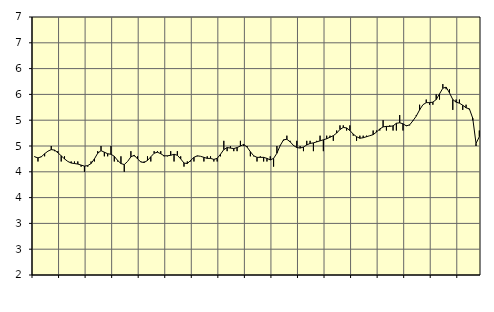
| Category | Piggar | Personliga och kulturella tjänster, SNI 90-98 |
|---|---|---|
| nan | 4.3 | 4.29 |
| 87.0 | 4.2 | 4.27 |
| 87.0 | 4.3 | 4.29 |
| 87.0 | 4.3 | 4.35 |
| nan | 4.4 | 4.4 |
| 88.0 | 4.5 | 4.43 |
| 88.0 | 4.4 | 4.42 |
| 88.0 | 4.4 | 4.37 |
| nan | 4.2 | 4.31 |
| 89.0 | 4.3 | 4.25 |
| 89.0 | 4.2 | 4.2 |
| 89.0 | 4.2 | 4.17 |
| nan | 4.2 | 4.16 |
| 90.0 | 4.2 | 4.15 |
| 90.0 | 4.1 | 4.13 |
| 90.0 | 4 | 4.11 |
| nan | 4.1 | 4.12 |
| 91.0 | 4.2 | 4.16 |
| 91.0 | 4.2 | 4.25 |
| 91.0 | 4.4 | 4.36 |
| nan | 4.5 | 4.41 |
| 92.0 | 4.3 | 4.38 |
| 92.0 | 4.3 | 4.35 |
| 92.0 | 4.5 | 4.34 |
| nan | 4.2 | 4.3 |
| 93.0 | 4.2 | 4.22 |
| 93.0 | 4.3 | 4.16 |
| 93.0 | 4 | 4.14 |
| nan | 4.2 | 4.2 |
| 94.0 | 4.4 | 4.29 |
| 94.0 | 4.3 | 4.32 |
| 94.0 | 4.3 | 4.25 |
| nan | 4.2 | 4.19 |
| 95.0 | 4.2 | 4.18 |
| 95.0 | 4.3 | 4.22 |
| 95.0 | 4.2 | 4.29 |
| nan | 4.4 | 4.36 |
| 96.0 | 4.4 | 4.38 |
| 96.0 | 4.4 | 4.35 |
| 96.0 | 4.3 | 4.31 |
| nan | 4.3 | 4.31 |
| 97.0 | 4.4 | 4.32 |
| 97.0 | 4.2 | 4.34 |
| 97.0 | 4.4 | 4.32 |
| nan | 4.3 | 4.25 |
| 98.0 | 4.1 | 4.17 |
| 98.0 | 4.2 | 4.16 |
| 98.0 | 4.2 | 4.22 |
| nan | 4.2 | 4.28 |
| 99.0 | 4.3 | 4.31 |
| 99.0 | 4.3 | 4.3 |
| 99.0 | 4.2 | 4.28 |
| nan | 4.3 | 4.26 |
| 0.0 | 4.3 | 4.26 |
| 0.0 | 4.2 | 4.24 |
| 0.0 | 4.2 | 4.26 |
| nan | 4.3 | 4.34 |
| 1.0 | 4.6 | 4.43 |
| 1.0 | 4.4 | 4.47 |
| 1.0 | 4.5 | 4.46 |
| nan | 4.4 | 4.45 |
| 2.0 | 4.4 | 4.47 |
| 2.0 | 4.6 | 4.5 |
| 2.0 | 4.5 | 4.53 |
| nan | 4.5 | 4.48 |
| 3.0 | 4.3 | 4.39 |
| 3.0 | 4.3 | 4.31 |
| 3.0 | 4.2 | 4.28 |
| nan | 4.3 | 4.28 |
| 4.0 | 4.2 | 4.28 |
| 4.0 | 4.2 | 4.26 |
| 4.0 | 4.3 | 4.23 |
| nan | 4.1 | 4.26 |
| 5.0 | 4.5 | 4.36 |
| 5.0 | 4.5 | 4.51 |
| 5.0 | 4.6 | 4.62 |
| nan | 4.7 | 4.63 |
| 6.0 | 4.6 | 4.58 |
| 6.0 | 4.5 | 4.51 |
| 6.0 | 4.6 | 4.47 |
| nan | 4.5 | 4.46 |
| 7.0 | 4.4 | 4.48 |
| 7.0 | 4.6 | 4.52 |
| 7.0 | 4.6 | 4.55 |
| nan | 4.4 | 4.56 |
| 8.0 | 4.6 | 4.58 |
| 8.0 | 4.7 | 4.6 |
| 8.0 | 4.4 | 4.62 |
| nan | 4.7 | 4.64 |
| 9.0 | 4.7 | 4.67 |
| 9.0 | 4.6 | 4.7 |
| 9.0 | 4.8 | 4.75 |
| nan | 4.9 | 4.82 |
| 10.0 | 4.9 | 4.86 |
| 10.0 | 4.8 | 4.85 |
| 10.0 | 4.9 | 4.8 |
| nan | 4.7 | 4.73 |
| 11.0 | 4.6 | 4.68 |
| 11.0 | 4.7 | 4.65 |
| 11.0 | 4.7 | 4.66 |
| nan | 4.7 | 4.68 |
| 12.0 | 4.7 | 4.7 |
| 12.0 | 4.8 | 4.72 |
| 12.0 | 4.8 | 4.77 |
| nan | 4.8 | 4.83 |
| 13.0 | 5 | 4.87 |
| 13.0 | 4.8 | 4.88 |
| 13.0 | 4.9 | 4.88 |
| nan | 4.8 | 4.89 |
| 14.0 | 4.8 | 4.94 |
| 14.0 | 5.1 | 4.95 |
| 14.0 | 4.8 | 4.93 |
| nan | 4.9 | 4.89 |
| 15.0 | 4.9 | 4.91 |
| 15.0 | 5 | 4.99 |
| 15.0 | 5.1 | 5.08 |
| nan | 5.3 | 5.2 |
| 16.0 | 5.3 | 5.3 |
| 16.0 | 5.4 | 5.34 |
| 16.0 | 5.3 | 5.34 |
| nan | 5.3 | 5.35 |
| 17.0 | 5.5 | 5.4 |
| 17.0 | 5.4 | 5.51 |
| 17.0 | 5.7 | 5.62 |
| nan | 5.6 | 5.64 |
| 18.0 | 5.6 | 5.53 |
| 18.0 | 5.2 | 5.4 |
| 18.0 | 5.4 | 5.35 |
| nan | 5.4 | 5.33 |
| 19.0 | 5.2 | 5.29 |
| 19.0 | 5.3 | 5.24 |
| 19.0 | 5.2 | 5.22 |
| nan | 5 | 5.04 |
| 20.0 | 4.5 | 4.55 |
| 20.0 | 4.8 | 4.68 |